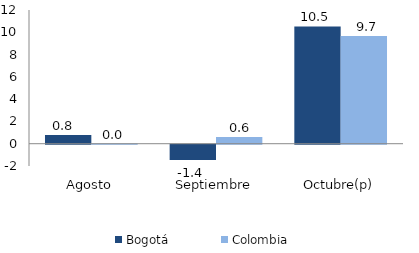
| Category | Bogotá | Colombia |
|---|---|---|
| Agosto | 0.783 | 0.01 |
| Septiembre | -1.375 | 0.612 |
| Octubre(p) | 10.525 | 9.669 |